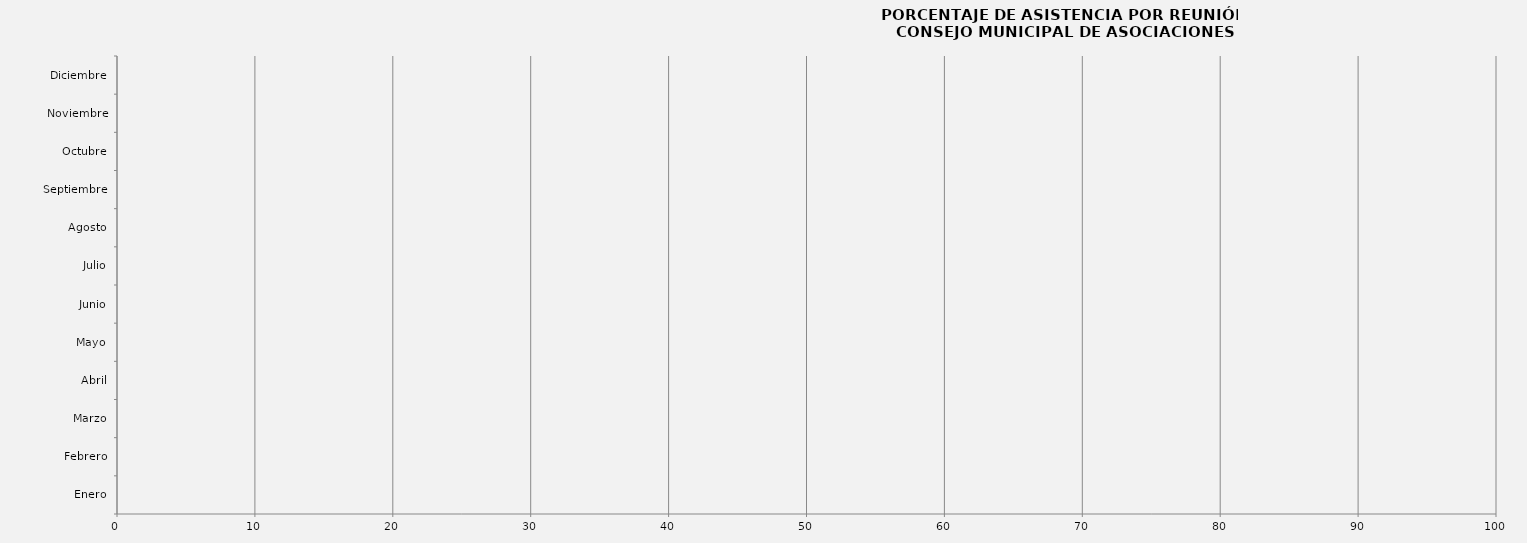
| Category | Enero |
|---|---|
| Enero | 0 |
| Febrero | 0 |
| Marzo | 0 |
| Abril | 0 |
| Mayo | 0 |
| Junio | 0 |
| Julio | 0 |
| Agosto | 0 |
| Septiembre | 0 |
| Octubre | 0 |
| Noviembre | 0 |
| Diciembre | 0 |